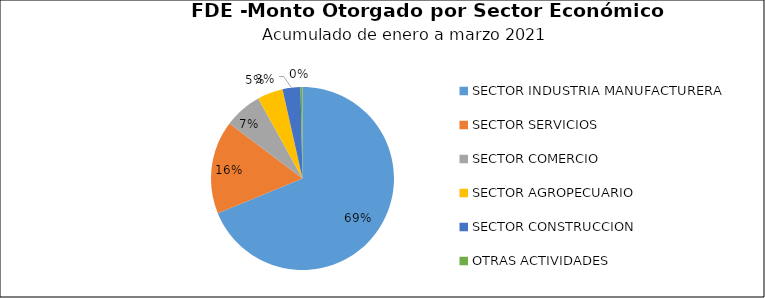
| Category | Monto | Créditos |
|---|---|---|
| SECTOR INDUSTRIA MANUFACTURERA | 3.572 | 50 |
| SECTOR SERVICIOS | 0.854 | 26 |
| SECTOR COMERCIO | 0.347 | 6 |
| SECTOR AGROPECUARIO | 0.235 | 5 |
| SECTOR CONSTRUCCION | 0.164 | 2 |
| OTRAS ACTIVIDADES | 0.018 | 1 |